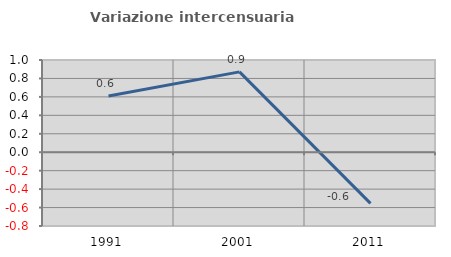
| Category | Variazione intercensuaria annua |
|---|---|
| 1991.0 | 0.611 |
| 2001.0 | 0.871 |
| 2011.0 | -0.555 |